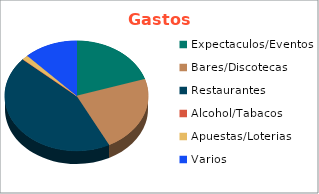
| Category | Series 0 |
|---|---|
| Expectaculos/Eventos | 500000 |
| Bares/Discotecas | 560000 |
| Restaurantes | 1100000 |
| Alcohol/Tabacos | 0 |
| Apuestas/Loterias | 35000 |
| Varios | 300000 |